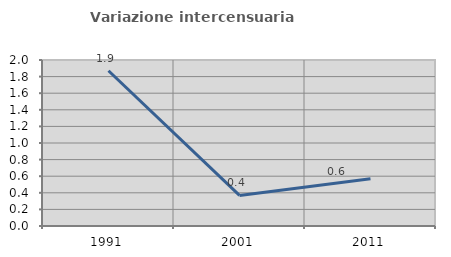
| Category | Variazione intercensuaria annua |
|---|---|
| 1991.0 | 1.87 |
| 2001.0 | 0.368 |
| 2011.0 | 0.568 |